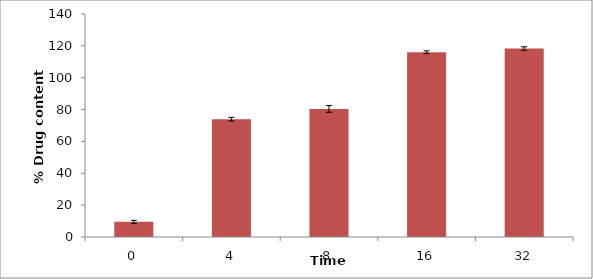
| Category | Series 1 |
|---|---|
| 0.0 | 9.5 |
| 4.0 | 74 |
| 8.0 | 80.4 |
| 16.0 | 116 |
| 32.0 | 118.3 |